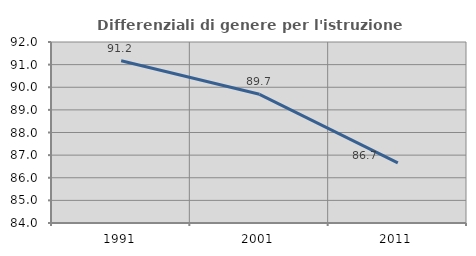
| Category | Differenziali di genere per l'istruzione superiore |
|---|---|
| 1991.0 | 91.169 |
| 2001.0 | 89.688 |
| 2011.0 | 86.654 |